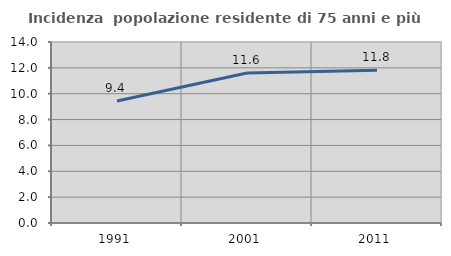
| Category | Incidenza  popolazione residente di 75 anni e più |
|---|---|
| 1991.0 | 9.433 |
| 2001.0 | 11.602 |
| 2011.0 | 11.809 |